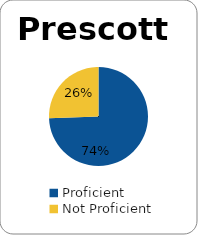
| Category | Series 0 |
|---|---|
| Proficient | 0.744 |
| Not Proficient | 0.256 |